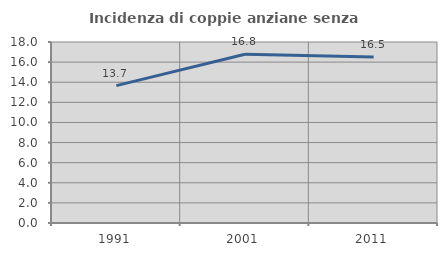
| Category | Incidenza di coppie anziane senza figli  |
|---|---|
| 1991.0 | 13.658 |
| 2001.0 | 16.782 |
| 2011.0 | 16.502 |